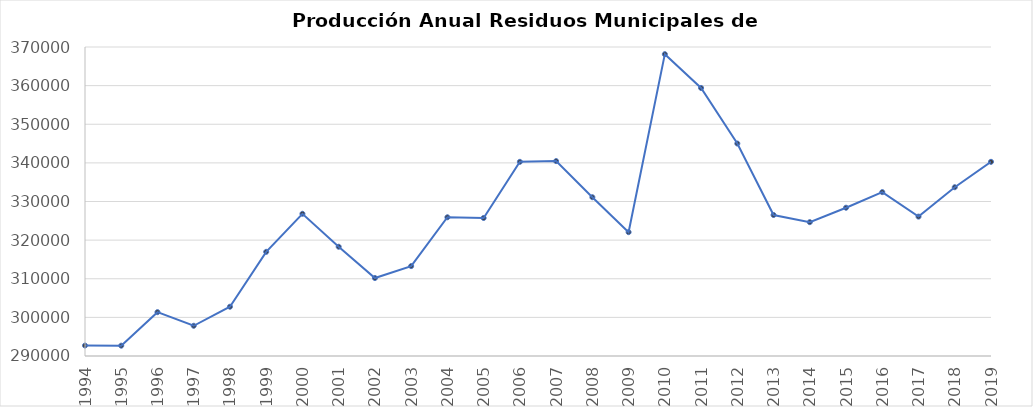
| Category | Toneladas |
|---|---|
| 1994.0 | 292705 |
| 1995.0 | 292675 |
| 1996.0 | 301351 |
| 1997.0 | 297826 |
| 1998.0 | 302755 |
| 1999.0 | 316971 |
| 2000.0 | 326821 |
| 2001.0 | 318287 |
| 2002.0 | 310189 |
| 2003.0 | 313276 |
| 2004.0 | 325915 |
| 2005.0 | 325734 |
| 2006.0 | 340271 |
| 2007.0 | 340458 |
| 2008.0 | 331106 |
| 2009.0 | 322060 |
| 2010.0 | 368145 |
| 2011.0 | 359391 |
| 2012.0 | 345010 |
| 2013.0 | 326503 |
| 2014.0 | 324650 |
| 2015.0 | 328391 |
| 2016.0 | 332428 |
| 2017.0 | 326087 |
| 2018.0 | 333693 |
| 2019.0 | 340273 |